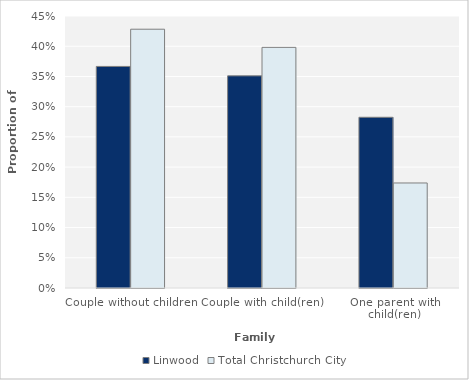
| Category | Linwood | Total Christchurch City |
|---|---|---|
| Couple without children | 0.367 | 0.428 |
| Couple with child(ren) | 0.351 | 0.398 |
| One parent with child(ren) | 0.282 | 0.174 |